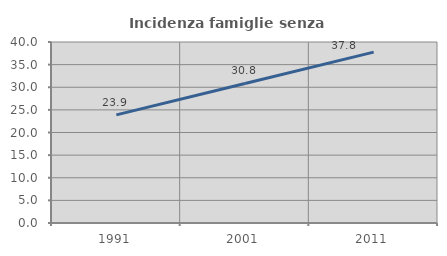
| Category | Incidenza famiglie senza nuclei |
|---|---|
| 1991.0 | 23.904 |
| 2001.0 | 30.837 |
| 2011.0 | 37.754 |